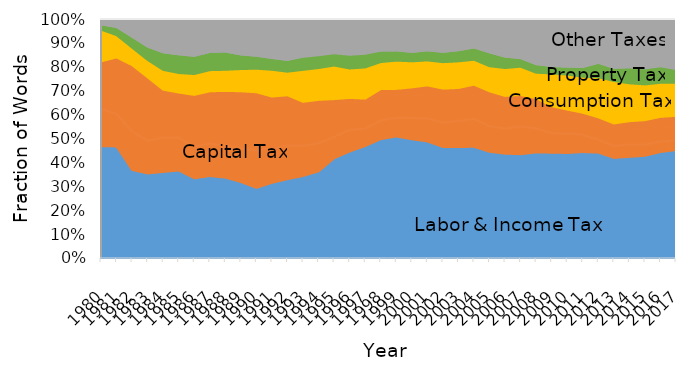
| Category | Labor Income Tax | Income Tax | Social Security Tax | Capital Tax | Dividend and Capital Gains Tax | Corporate Income Tax | Wealth Tax | Estate Tax | Consumption Tax | Property Tax | Transaction Tax | Lump Sum Tax | Other |
|---|---|---|---|---|---|---|---|---|---|---|---|---|---|
| 1980.0 | 0.09 | 0.255 | 0.123 | 0.083 | 0.073 | 0.198 | 0 | 0 | 0.133 | 0.022 | 0 | 0.018 | 0.004 |
| 1981.0 | 0.067 | 0.256 | 0.144 | 0.036 | 0.101 | 0.236 | 0 | 0 | 0.093 | 0.034 | 0 | 0.021 | 0.012 |
| 1982.0 | 0.054 | 0.235 | 0.08 | 0.05 | 0.112 | 0.276 | 0.001 | 0 | 0.073 | 0.046 | 0 | 0.027 | 0.047 |
| 1983.0 | 0.044 | 0.234 | 0.076 | 0.033 | 0.104 | 0.26 | 0.004 | 0.001 | 0.073 | 0.056 | 0 | 0.036 | 0.079 |
| 1984.0 | 0.041 | 0.241 | 0.078 | 0.042 | 0.103 | 0.194 | 0.004 | 0.001 | 0.083 | 0.074 | 0 | 0.044 | 0.095 |
| 1985.0 | 0.038 | 0.24 | 0.088 | 0.042 | 0.095 | 0.183 | 0.004 | 0.003 | 0.082 | 0.078 | 0 | 0.043 | 0.105 |
| 1986.0 | 0.039 | 0.213 | 0.081 | 0.047 | 0.086 | 0.203 | 0.005 | 0.007 | 0.087 | 0.076 | 0 | 0.053 | 0.101 |
| 1987.0 | 0.036 | 0.216 | 0.091 | 0.039 | 0.097 | 0.203 | 0.005 | 0.011 | 0.089 | 0.076 | 0 | 0.051 | 0.087 |
| 1988.0 | 0.033 | 0.224 | 0.079 | 0.047 | 0.087 | 0.208 | 0.005 | 0.015 | 0.088 | 0.077 | 0 | 0.045 | 0.091 |
| 1989.0 | 0.033 | 0.213 | 0.072 | 0.055 | 0.085 | 0.218 | 0.005 | 0.017 | 0.093 | 0.061 | 0 | 0.048 | 0.101 |
| 1990.0 | 0.03 | 0.214 | 0.05 | 0.057 | 0.099 | 0.222 | 0.005 | 0.016 | 0.099 | 0.054 | 0 | 0.055 | 0.098 |
| 1991.0 | 0.036 | 0.239 | 0.039 | 0.055 | 0.086 | 0.196 | 0.007 | 0.017 | 0.112 | 0.049 | 0 | 0.05 | 0.113 |
| 1992.0 | 0.042 | 0.26 | 0.027 | 0.057 | 0.084 | 0.186 | 0.007 | 0.016 | 0.099 | 0.049 | 0 | 0.055 | 0.116 |
| 1993.0 | 0.047 | 0.267 | 0.03 | 0.05 | 0.076 | 0.164 | 0.004 | 0.016 | 0.134 | 0.055 | 0.005 | 0.052 | 0.101 |
| 1994.0 | 0.061 | 0.27 | 0.032 | 0.045 | 0.072 | 0.164 | 0.004 | 0.014 | 0.133 | 0.054 | 0.005 | 0.045 | 0.102 |
| 1995.0 | 0.068 | 0.288 | 0.061 | 0.04 | 0.049 | 0.141 | 0.004 | 0.014 | 0.14 | 0.051 | 0.005 | 0.035 | 0.104 |
| 1996.0 | 0.075 | 0.292 | 0.078 | 0.037 | 0.054 | 0.12 | 0.002 | 0.011 | 0.123 | 0.057 | 0.005 | 0.031 | 0.114 |
| 1997.0 | 0.078 | 0.28 | 0.111 | 0.038 | 0.035 | 0.113 | 0.001 | 0.011 | 0.131 | 0.057 | 0.005 | 0.028 | 0.112 |
| 1998.0 | 0.083 | 0.279 | 0.136 | 0.046 | 0.032 | 0.12 | 0.002 | 0.009 | 0.113 | 0.048 | 0 | 0.026 | 0.106 |
| 1999.0 | 0.073 | 0.285 | 0.15 | 0.044 | 0.034 | 0.101 | 0.003 | 0.017 | 0.118 | 0.043 | 0 | 0.024 | 0.107 |
| 2000.0 | 0.068 | 0.28 | 0.149 | 0.038 | 0.051 | 0.1 | 0.003 | 0.025 | 0.109 | 0.04 | 0 | 0.027 | 0.111 |
| 2001.0 | 0.056 | 0.276 | 0.156 | 0.041 | 0.055 | 0.1 | 0.003 | 0.036 | 0.105 | 0.042 | 0 | 0.034 | 0.097 |
| 2002.0 | 0.05 | 0.274 | 0.141 | 0.041 | 0.061 | 0.104 | 0.003 | 0.035 | 0.111 | 0.043 | 0 | 0.032 | 0.106 |
| 2003.0 | 0.055 | 0.275 | 0.135 | 0.046 | 0.064 | 0.094 | 0.002 | 0.041 | 0.111 | 0.047 | 0 | 0.036 | 0.094 |
| 2004.0 | 0.052 | 0.276 | 0.138 | 0.045 | 0.072 | 0.104 | 0.001 | 0.039 | 0.104 | 0.051 | 0 | 0.035 | 0.083 |
| 2005.0 | 0.053 | 0.261 | 0.13 | 0.048 | 0.059 | 0.109 | 0 | 0.036 | 0.105 | 0.058 | 0 | 0.034 | 0.106 |
| 2006.0 | 0.056 | 0.263 | 0.117 | 0.049 | 0.056 | 0.104 | 0.001 | 0.032 | 0.117 | 0.048 | 0 | 0.026 | 0.131 |
| 2007.0 | 0.058 | 0.261 | 0.116 | 0.055 | 0.06 | 0.096 | 0.001 | 0.035 | 0.118 | 0.036 | 0 | 0.032 | 0.131 |
| 2008.0 | 0.048 | 0.278 | 0.115 | 0.042 | 0.058 | 0.097 | 0.001 | 0.029 | 0.106 | 0.036 | 0 | 0.025 | 0.164 |
| 2009.0 | 0.048 | 0.289 | 0.104 | 0.038 | 0.044 | 0.084 | 0.001 | 0.029 | 0.137 | 0.031 | 0 | 0.026 | 0.17 |
| 2010.0 | 0.054 | 0.289 | 0.097 | 0.041 | 0.041 | 0.073 | 0.001 | 0.026 | 0.146 | 0.033 | 0 | 0.025 | 0.174 |
| 2011.0 | 0.056 | 0.285 | 0.102 | 0.034 | 0.039 | 0.073 | 0 | 0.018 | 0.151 | 0.04 | 0.003 | 0.028 | 0.171 |
| 2012.0 | 0.054 | 0.29 | 0.096 | 0.025 | 0.028 | 0.077 | 0.001 | 0.017 | 0.168 | 0.06 | 0.003 | 0.023 | 0.158 |
| 2013.0 | 0.057 | 0.259 | 0.102 | 0.025 | 0.025 | 0.07 | 0.001 | 0.023 | 0.178 | 0.054 | 0.008 | 0.031 | 0.166 |
| 2014.0 | 0.059 | 0.259 | 0.105 | 0.03 | 0.022 | 0.07 | 0.004 | 0.023 | 0.159 | 0.066 | 0.011 | 0.035 | 0.157 |
| 2015.0 | 0.051 | 0.276 | 0.1 | 0.024 | 0.023 | 0.07 | 0.006 | 0.026 | 0.15 | 0.067 | 0.011 | 0.04 | 0.156 |
| 2016.0 | 0.051 | 0.297 | 0.096 | 0.023 | 0.02 | 0.065 | 0.008 | 0.031 | 0.143 | 0.069 | 0.008 | 0.039 | 0.151 |
| 2017.0 | 0.047 | 0.304 | 0.101 | 0.02 | 0.021 | 0.057 | 0.012 | 0.033 | 0.138 | 0.057 | 0.008 | 0.041 | 0.16 |